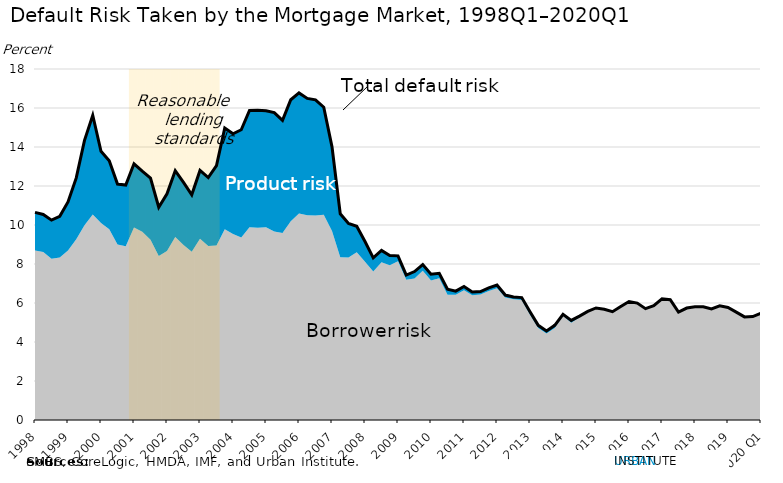
| Category | Highlight |
|---|---|
| 1998.0 | 0 |
| 1998.0 | 0 |
| 1998.0 | 0 |
| 1998.0 | 0 |
| 1999.0 | 0 |
| 1999.0 | 0 |
| 1999.0 | 0 |
| 1999.0 | 0 |
| 2000.0 | 0 |
| 2000.0 | 0 |
| 2000.0 | 0 |
| 2000.0 | 0 |
| 2001.0 | 18 |
| 2001.0 | 18 |
| 2001.0 | 18 |
| 2001.0 | 18 |
| 2002.0 | 18 |
| 2002.0 | 18 |
| 2002.0 | 18 |
| 2002.0 | 18 |
| 2003.0 | 18 |
| 2003.0 | 18 |
| 2003.0 | 18 |
| 2003.0 | 0 |
| 2004.0 | 0 |
| 2004.0 | 0 |
| 2004.0 | 0 |
| 2004.0 | 0 |
| 2005.0 | 0 |
| 2005.0 | 0 |
| 2005.0 | 0 |
| 2005.0 | 0 |
| 2006.0 | 0 |
| 2006.0 | 0 |
| 2006.0 | 0 |
| 2006.0 | 0 |
| 2007.0 | 0 |
| 2007.0 | 0 |
| 2007.0 | 0 |
| 2007.0 | 0 |
| 2008.0 | 0 |
| 2008.0 | 0 |
| 2008.0 | 0 |
| 2008.0 | 0 |
| 2009.0 | 0 |
| 2009.0 | 0 |
| 2009.0 | 0 |
| 2009.0 | 0 |
| 2010.0 | 0 |
| 2010.0 | 0 |
| 2010.0 | 0 |
| 2010.0 | 0 |
| 2011.0 | 0 |
| 2011.0 | 0 |
| 2011.0 | 0 |
| 2011.0 | 0 |
| 2012.0 | 0 |
| 2012.0 | 0 |
| 2012.0 | 0 |
| 2012.0 | 0 |
| 2013.0 | 0 |
| 2013.0 | 0 |
| 2013.0 | 0 |
| 2013.0 | 0 |
| 2014.0 | 0 |
| 2014.0 | 0 |
| 2014.0 | 0 |
| 2014.0 | 0 |
| 2015.0 | 0 |
| 2015.0 | 0 |
| 2015.0 | 0 |
| 2015.0 | 0 |
| 2016.0 | 0 |
| 2016.0 | 0 |
| 2016.0 | 0 |
| 2016.0 | 0 |
| 2017.0 | 0 |
| 2017.0 | 0 |
| 2017.0 | 0 |
| 2017.0 | 0 |
| 2018.0 | 0 |
| 2018.0 | 0 |
| 2018.0 | 0 |
| 2018.0 | 0 |